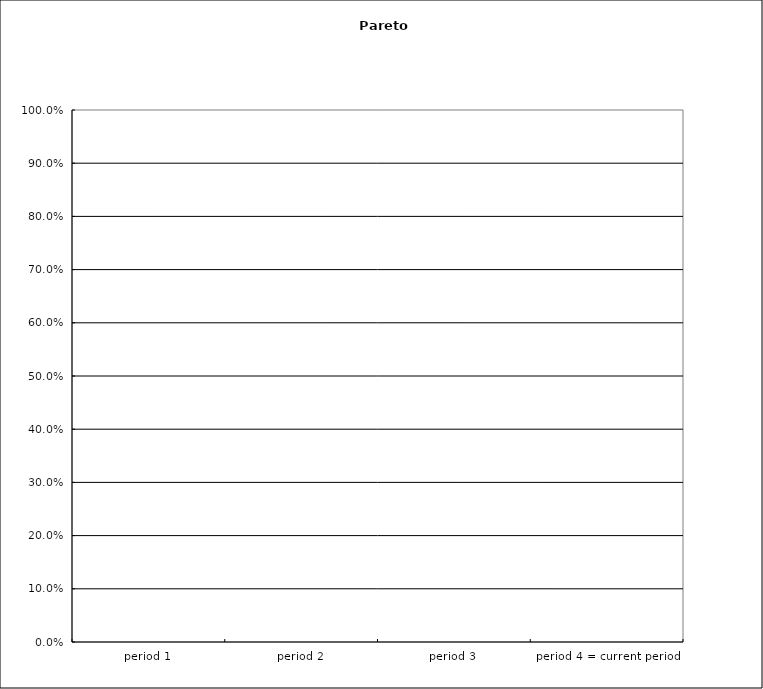
| Category | Characteristic 1 |
|---|---|
| period 1 | 0 |
| period 2 | 0 |
| period 3 | 0 |
| period 4 = current period | 0 |